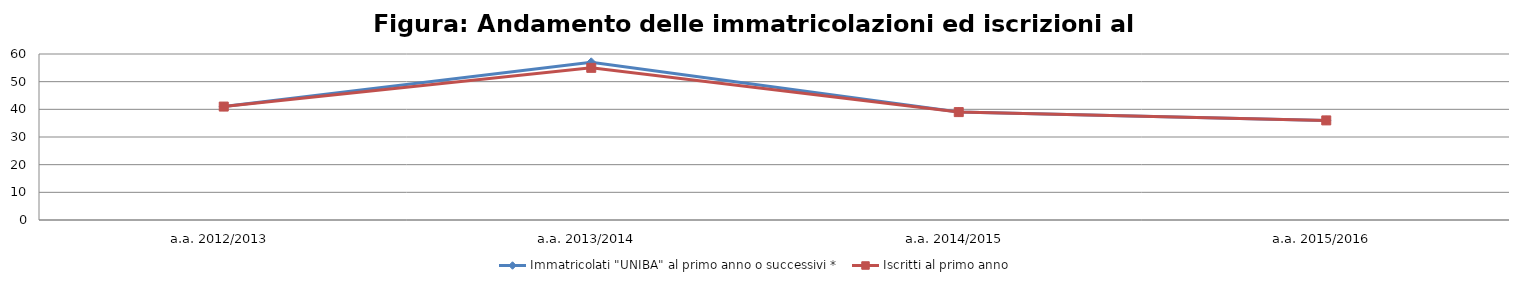
| Category | Immatricolati "UNIBA" al primo anno o successivi * | Iscritti al primo anno  |
|---|---|---|
| a.a. 2012/2013 | 41 | 41 |
| a.a. 2013/2014 | 57 | 55 |
| a.a. 2014/2015 | 39 | 39 |
| a.a. 2015/2016 | 36 | 36 |